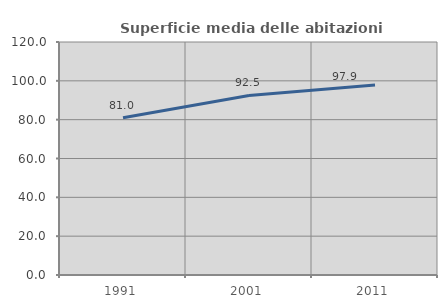
| Category | Superficie media delle abitazioni occupate |
|---|---|
| 1991.0 | 81.002 |
| 2001.0 | 92.481 |
| 2011.0 | 97.862 |